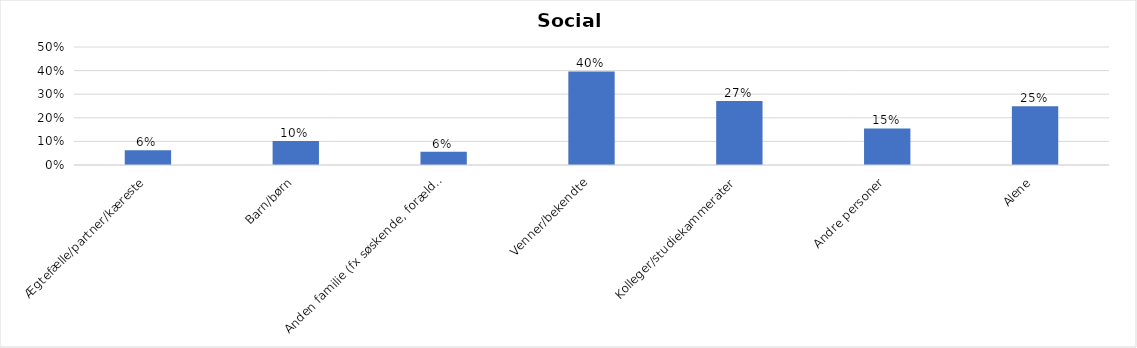
| Category | % |
|---|---|
| Ægtefælle/partner/kæreste | 0.062 |
| Barn/børn | 0.102 |
| Anden familie (fx søskende, forældre) | 0.057 |
| Venner/bekendte | 0.396 |
| Kolleger/studiekammerater | 0.272 |
| Andre personer | 0.155 |
| Alene | 0.249 |